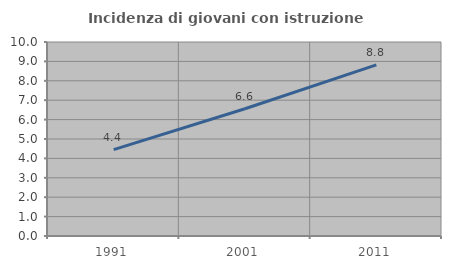
| Category | Incidenza di giovani con istruzione universitaria |
|---|---|
| 1991.0 | 4.45 |
| 2001.0 | 6.558 |
| 2011.0 | 8.819 |